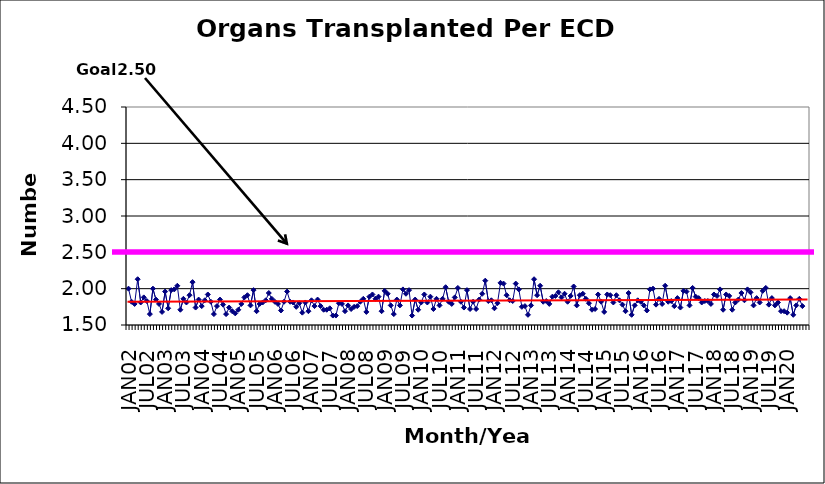
| Category | Series 0 |
|---|---|
| JAN02 | 2 |
| FEB02 | 1.82 |
| MAR02 | 1.79 |
| APR02 | 2.13 |
| MAY02 | 1.81 |
| JUN02 | 1.88 |
| JUL02 | 1.83 |
| AUG02 | 1.65 |
| SEP02 | 2 |
| OCT02 | 1.85 |
| NOV02 | 1.79 |
| DEC02 | 1.68 |
| JAN03 | 1.96 |
| FEB03 | 1.73 |
| MAR03 | 1.98 |
| APR03 | 1.99 |
| MAY03 | 2.04 |
| JUN03 | 1.71 |
| JUL03 | 1.86 |
| AUG03 | 1.81 |
| SEP03 | 1.91 |
| OCT03 | 2.09 |
| NOV03 | 1.74 |
| DEC03 | 1.85 |
| JAN04 | 1.76 |
| FEB04 | 1.84 |
| MAR04 | 1.92 |
| APR04 | 1.82 |
| MAY04 | 1.65 |
| JUN04 | 1.76 |
| JUL04 | 1.85 |
| AUG04 | 1.78 |
| SEP04 | 1.65 |
| OCT04 | 1.74 |
| NOV04 | 1.69 |
| DEC04 | 1.66 |
| JAN05 | 1.71 |
| FEB05 | 1.79 |
| MAR05 | 1.88 |
| APR05 | 1.91 |
| MAY05 | 1.77 |
| JUN05 | 1.98 |
| JUL05 | 1.69 |
| AUG05 | 1.79 |
| SEP05 | 1.81 |
| OCT05 | 1.84 |
| NOV05 | 1.94 |
| DEC05 | 1.86 |
| JAN06 | 1.82 |
| FEB06 | 1.79 |
| MAR06 | 1.7 |
| APR06 | 1.82 |
| MAY06 | 1.96 |
| JUN06 | 1.82 |
| JUL06 | 1.81 |
| AUG06 | 1.75 |
| SEP06 | 1.8 |
| OCT06 | 1.67 |
| NOV06 | 1.81 |
| DEC06 | 1.69 |
| JAN07 | 1.84 |
| FEB07 | 1.76 |
| MAR07 | 1.85 |
| APR07 | 1.76 |
| MAY07 | 1.71 |
| JUN07 | 1.71 |
| JUL07 | 1.73 |
| AUG07 | 1.63 |
| SEP07 | 1.63 |
| OCT07 | 1.8 |
| NOV07 | 1.79 |
| DEC07 | 1.69 |
| JAN08 | 1.77 |
| FEB08 | 1.72 |
| MAR08 | 1.75 |
| APR08 | 1.76 |
| MAY08 | 1.82 |
| JUN08 | 1.86 |
| JUL08 | 1.68 |
| AUG08 | 1.89 |
| SEP08 | 1.92 |
| OCT08 | 1.86 |
| NOV08 | 1.89 |
| DEC08 | 1.69 |
| JAN09 | 1.97 |
| FEB09 | 1.93 |
| MAR09 | 1.77 |
| APR09 | 1.65 |
| MAY09 | 1.85 |
| JUN09 | 1.77 |
| JUL09 | 1.99 |
| AUG09 | 1.93 |
| SEP09 | 1.98 |
| OCT09 | 1.63 |
| NOV09 | 1.85 |
| DEC09 | 1.71 |
| JAN10 | 1.81 |
| FEB10 | 1.92 |
| MAR10 | 1.81 |
| APR10 | 1.89 |
| MAY10 | 1.72 |
| JUN10 | 1.86 |
| JUL10 | 1.77 |
| AUG10 | 1.86 |
| SEP10 | 2.02 |
| OCT10 | 1.82 |
| NOV10 | 1.79 |
| DEC10 | 1.88 |
| JAN11 | 2.01 |
| FEB11 | 1.82 |
| MAR11 | 1.74 |
| APR11 | 1.98 |
| MAY11 | 1.72 |
| JUN11 | 1.82 |
| JUL11 | 1.72 |
| AUG11 | 1.85 |
| SEP11 | 1.93 |
| OCT11 | 2.11 |
| NOV11 | 1.83 |
| DEC11 | 1.84 |
| JAN12 | 1.73 |
| FEB12 | 1.8 |
| MAR12 | 2.08 |
| APR12 | 2.07 |
| MAY12 | 1.91 |
| JUN12 | 1.84 |
| JUL12 | 1.83 |
| AUG12 | 2.07 |
| SEP12 | 1.99 |
| OCT12 | 1.75 |
| NOV12 | 1.76 |
| DEC12 | 1.64 |
| JAN13 | 1.77 |
| FEB13 | 2.13 |
| MAR13 | 1.91 |
| APR13 | 2.04 |
| MAY13 | 1.82 |
| JUN13 | 1.83 |
| JUL13 | 1.79 |
| AUG13 | 1.89 |
| SEP13 | 1.9 |
| OCT13 | 1.95 |
| NOV13 | 1.88 |
| DEC13 | 1.93 |
| JAN14 | 1.82 |
| FEB14 | 1.9 |
| MAR14 | 2.03 |
| APR14 | 1.77 |
| MAY14 | 1.91 |
| JUN14 | 1.93 |
| JUL14 | 1.86 |
| AUG14 | 1.8 |
| SEP14 | 1.71 |
| OCT14 | 1.72 |
| NOV14 | 1.92 |
| DEC14 | 1.82 |
| JAN15 | 1.68 |
| FEB15 | 1.92 |
| MAR15 | 1.91 |
| APR15 | 1.81 |
| MAY15 | 1.91 |
| JUN15 | 1.84 |
| JUL15 | 1.78 |
| AUG15 | 1.69 |
| SEP15 | 1.94 |
| OCT15 | 1.64 |
| NOV15 | 1.77 |
| DEC15 | 1.84 |
| JAN16 | 1.82 |
| FEB16 | 1.77 |
| MAR16 | 1.7 |
| APR16 | 1.99 |
| MAY16 | 2 |
| JUN16 | 1.78 |
| JUL16 | 1.86 |
| AUG16 | 1.79 |
| SEP16 | 2.04 |
| OCT16 | 1.82 |
| NOV16 | 1.83 |
| DEC16 | 1.76 |
| JAN17 | 1.87 |
| FEB17 | 1.74 |
| MAR17 | 1.97 |
| APR17 | 1.96 |
| MAY17 | 1.77 |
| JUN17 | 2.01 |
| JUL17 | 1.89 |
| AUG17 | 1.87 |
| SEP17 | 1.81 |
| OCT17 | 1.83 |
| NOV17 | 1.83 |
| DEC17 | 1.79 |
| JAN18 | 1.92 |
| FEB18 | 1.9 |
| MAR18 | 1.99 |
| APR18 | 1.71 |
| MAY18 | 1.92 |
| JUN18 | 1.9 |
| JUL18 | 1.71 |
| AUG18 | 1.81 |
| SEP18 | 1.85 |
| OCT18 | 1.94 |
| NOV18 | 1.84 |
| DEC18 | 1.99 |
| JAN19 | 1.95 |
| FEB19 | 1.77 |
| MAR19 | 1.87 |
| APR19 | 1.81 |
| MAY19 | 1.97 |
| JUN19 | 2.01 |
| JUL19 | 1.78 |
| AUG19 | 1.87 |
| SEP19 | 1.77 |
| OCT19 | 1.81 |
| NOV19 | 1.69 |
| DEC19 | 1.69 |
| JAN20 | 1.67 |
| FEB20 | 1.87 |
| MAR20 | 1.64 |
| APR20 | 1.77 |
| MAY20 | 1.86 |
| JUN20 | 1.76 |